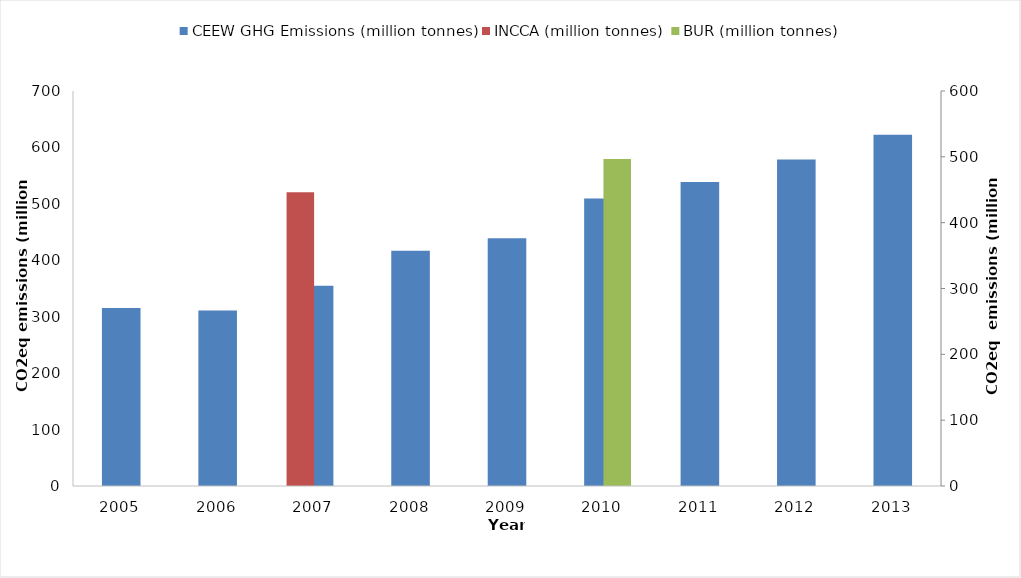
| Category | CEEW GHG Emissions (million tonnes) |
|---|---|
| 2005.0 | 315.441 |
| 2006.0 | 310.886 |
| 2007.0 | 354.872 |
| 2008.0 | 416.809 |
| 2009.0 | 439.206 |
| 2010.0 | 509.439 |
| 2011.0 | 538.946 |
| 2012.0 | 578.731 |
| 2013.0 | 622.575 |